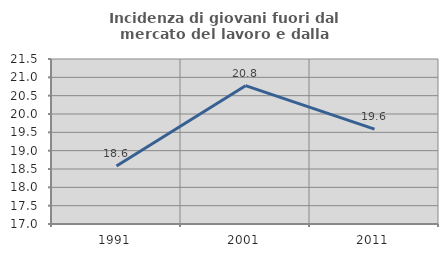
| Category | Incidenza di giovani fuori dal mercato del lavoro e dalla formazione  |
|---|---|
| 1991.0 | 18.581 |
| 2001.0 | 20.773 |
| 2011.0 | 19.586 |